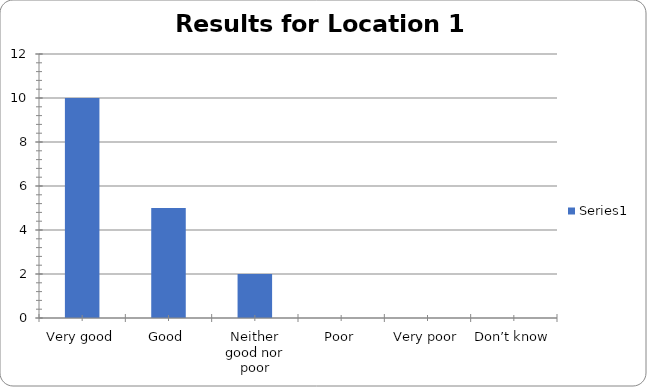
| Category | Series 0 |
|---|---|
| Very good | 10 |
| Good | 5 |
| Neither good nor poor | 2 |
| Poor | 0 |
| Very poor | 0 |
| Don’t know | 0 |